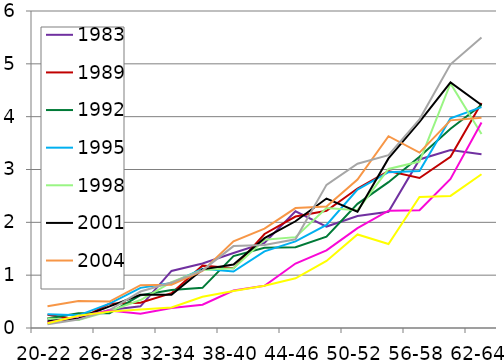
| Category | 1983 | 1989 | 1992 | 1995 | 1998 | 2001 | 2004 | 2007 | 2010 | 2013 |
|---|---|---|---|---|---|---|---|---|---|---|
| 20-22 | 0.18 | 0.25 | 0.18 | 0.26 | 0.18 | 0.13 | 0.41 | 0.07 | 0.1 | 0.09 |
| 23-25 | 0.16 | 0.16 | 0.28 | 0.24 | 0.15 | 0.18 | 0.51 | 0.16 | 0.22 | 0.23 |
| 26-28 | 0.34 | 0.46 | 0.28 | 0.46 | 0.32 | 0.41 | 0.5 | 0.34 | 0.33 | 0.31 |
| 29-31 | 0.41 | 0.48 | 0.62 | 0.76 | 0.53 | 0.63 | 0.81 | 0.69 | 0.27 | 0.35 |
| 32-34 | 1.08 | 0.66 | 0.72 | 0.85 | 0.87 | 0.63 | 0.82 | 0.86 | 0.38 | 0.39 |
| 35-37 | 1.22 | 1.18 | 0.76 | 1.12 | 1.1 | 1.11 | 1.08 | 1.09 | 0.44 | 0.59 |
| 38-40 | 1.42 | 1.13 | 1.36 | 1.07 | 1.13 | 1.2 | 1.64 | 1.55 | 0.71 | 0.7 |
| 41-43 | 1.61 | 1.78 | 1.52 | 1.45 | 1.67 | 1.7 | 1.88 | 1.57 | 0.8 | 0.8 |
| 44-46 | 2.21 | 2.11 | 1.53 | 1.64 | 1.72 | 2.02 | 2.27 | 1.68 | 1.22 | 0.94 |
| 47-49 | 1.92 | 2.22 | 1.73 | 1.95 | 2.27 | 2.45 | 2.3 | 2.71 | 1.47 | 1.27 |
| 50-52 | 2.12 | 2.64 | 2.35 | 2.62 | 2.23 | 2.2 | 2.81 | 3.11 | 1.89 | 1.77 |
| 53-55 | 2.2 | 2.97 | 2.76 | 2.95 | 3.01 | 3.21 | 3.63 | 3.27 | 2.22 | 1.59 |
| 56-58 | 3.19 | 2.84 | 3.24 | 2.97 | 3.15 | 3.9 | 3.32 | 3.95 | 2.23 | 2.48 |
| 59-61 | 3.37 | 3.24 | 3.77 | 3.97 | 4.63 | 4.65 | 3.93 | 4.99 | 2.82 | 2.5 |
| 62-64 | 3.29 | 4.26 | 4.22 | 4.18 | 3.67 | 4.22 | 3.98 | 5.5 | 3.89 | 2.91 |